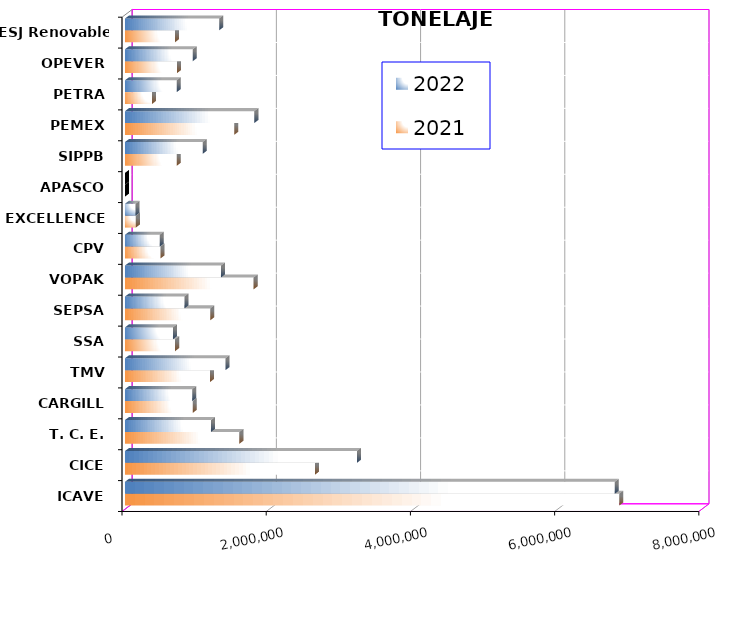
| Category | 2021 | 2022 |
|---|---|---|
| ICAVE | 6854497.135 | 6793069.391 |
| CICE | 2634677.247 | 3217127.578 |
| T. C. E. | 1585836.917 | 1191682.315 |
| CARGILL | 939577.06 | 932693.161 |
| TMV | 1179379.15 | 1393786.83 |
| SSA | 695247.838 | 664941.398 |
| SEPSA | 1183461.52 | 824495.01 |
| VOPAK | 1784179.678 | 1330146.993 |
| CPV | 492065.108 | 483010.64 |
| EXCELLENCE | 150407.18 | 146300.787 |
| APASCO | 0 | 0 |
| SIPPB | 718896.158 | 1077433.806 |
| PEMEX | 1514010.424 | 1793978.99 |
| PETRA | 374709.38 | 718626.83 |
| OPEVER | 722357.386 | 940034.689 |
| ESJ Renovable III | 694344.61 | 1306300.354 |